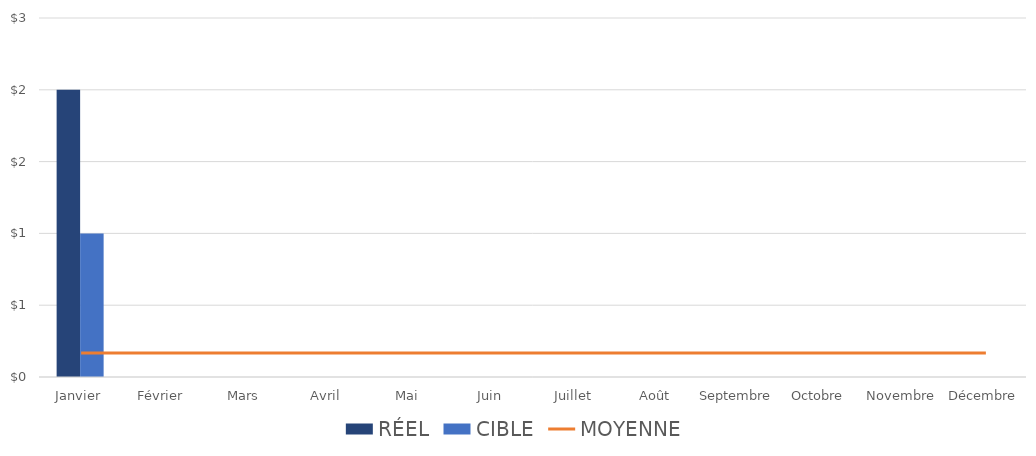
| Category | RÉEL | CIBLE |
|---|---|---|
| Janvier | 2 | 1 |
| Février | 0 | 0 |
| Mars | 0 | 0 |
| Avril | 0 | 0 |
| Mai | 0 | 0 |
| Juin | 0 | 0 |
| Juillet | 0 | 0 |
| Août | 0 | 0 |
| Septembre | 0 | 0 |
| Octobre | 0 | 0 |
| Novembre | 0 | 0 |
| Décembre | 0 | 0 |